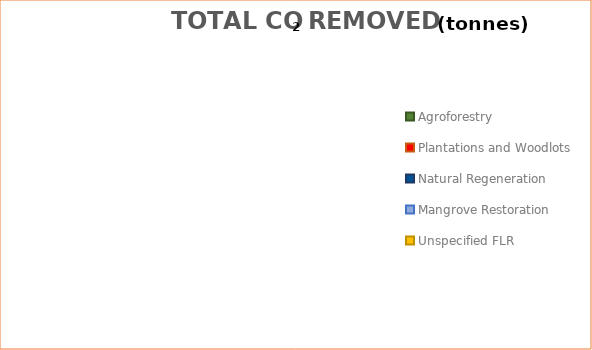
| Category | Series 0 |
|---|---|
| Agroforestry | 0 |
| Plantations and Woodlots | 0 |
| Natural Regeneration | 0 |
| Mangrove Restoration | 0 |
| Unspecified FLR | 0 |